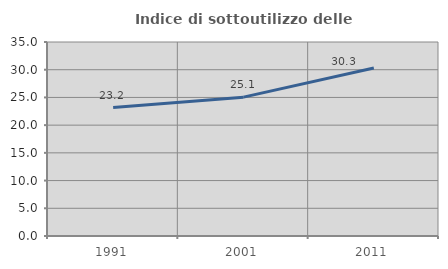
| Category | Indice di sottoutilizzo delle abitazioni  |
|---|---|
| 1991.0 | 23.176 |
| 2001.0 | 25.053 |
| 2011.0 | 30.3 |